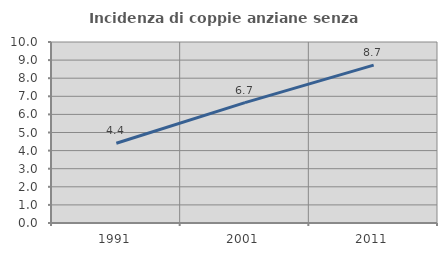
| Category | Incidenza di coppie anziane senza figli  |
|---|---|
| 1991.0 | 4.408 |
| 2001.0 | 6.652 |
| 2011.0 | 8.72 |